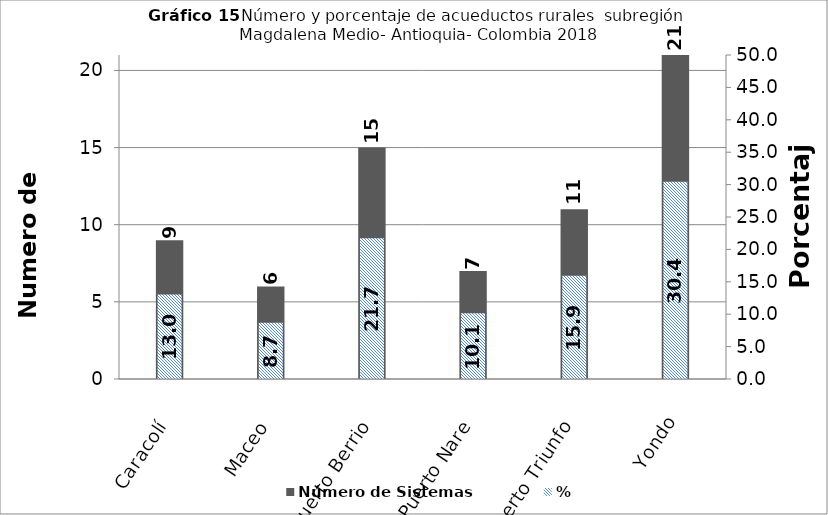
| Category | Número de Sistemas |
|---|---|
| Caracolí | 9 |
| Maceo | 6 |
| Puerto Berrio | 15 |
| Puerto Nare | 7 |
| Puerto Triunfo | 11 |
| Yondo | 21 |